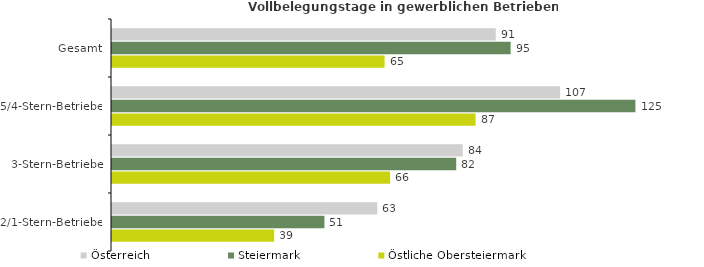
| Category | Österreich | Steiermark | Östliche Obersteiermark |
|---|---|---|---|
| Gesamt | 91.375 | 94.907 | 64.896 |
| 5/4-Stern-Betriebe | 106.695 | 124.622 | 86.564 |
| 3-Stern-Betriebe | 83.508 | 81.957 | 66.221 |
| 2/1-Stern-Betriebe | 63.173 | 50.58 | 38.607 |